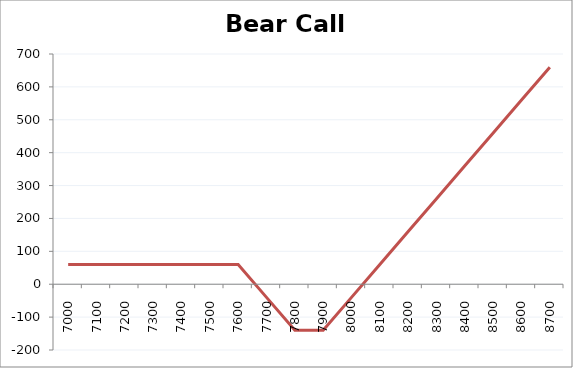
| Category | Net Payoff |
|---|---|
| 7000.0 | 60 |
| 7100.0 | 60 |
| 7200.0 | 60 |
| 7300.0 | 60 |
| 7400.0 | 60 |
| 7500.0 | 60 |
| 7600.0 | 60 |
| 7700.0 | -40 |
| 7800.0 | -140 |
| 7900.0 | -140 |
| 8000.0 | -40 |
| 8100.0 | 60 |
| 8200.0 | 160 |
| 8300.0 | 260 |
| 8400.0 | 360 |
| 8500.0 | 460 |
| 8600.0 | 560 |
| 8700.0 | 660 |